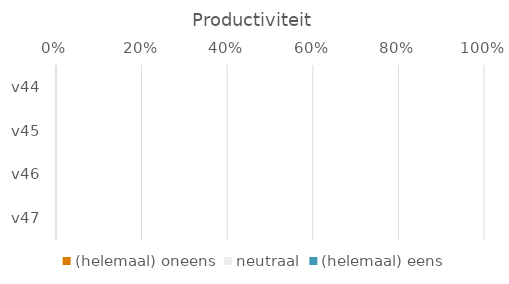
| Category | (helemaal) oneens | neutraal | (helemaal) eens |
|---|---|---|---|
| v44 | 0 | 0 | 0 |
| v45 | 0 | 0 | 0 |
| v46 | 0 | 0 | 0 |
| v47 | 0 | 0 | 0 |